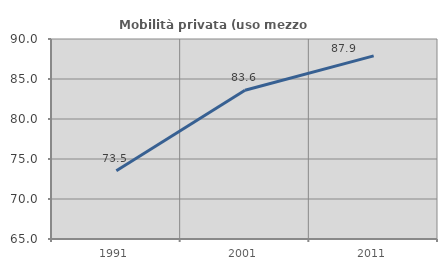
| Category | Mobilità privata (uso mezzo privato) |
|---|---|
| 1991.0 | 73.528 |
| 2001.0 | 83.598 |
| 2011.0 | 87.887 |